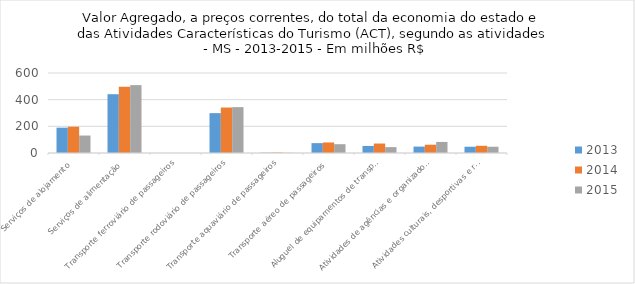
| Category | 2013 | 2014 | 2015 |
|---|---|---|---|
| Serviços de alojamento | 190 | 197 | 131 |
| Serviços de alimentação | 441 | 497 | 509 |
| Transporte ferroviário de passageiros | 0 | 0 | 0 |
| Transporte rodoviário de passageiros | 299 | 341 | 344 |
| Transporte aquaviário de passageiros | 2.4 | 3.3 | 1.6 |
| Transporte aéreo de passageiros | 74 | 79 | 66 |
| Aluguel de equipamentos de transporte | 53 | 71 | 44 |
| Atividades de agências e organizadoras de viagens | 48 | 62 | 83 |
| Atividades culturais, desportivas e recreativas | 47 | 54 | 47 |